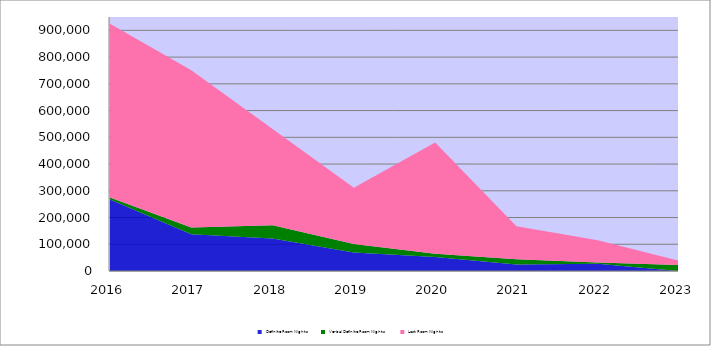
| Category | Definite Room Nights | Verbal Definite Room Nights | Lost Room Nights |
|---|---|---|---|
| 2016.0 | 266985 | 8018 | 650013 |
| 2017.0 | 137651 | 24878 | 588498 |
| 2018.0 | 121918 | 48887 | 360079 |
| 2019.0 | 68899 | 31699 | 210951 |
| 2020.0 | 52056 | 12090 | 416522 |
| 2021.0 | 23925 | 20387 | 123440 |
| 2022.0 | 27014 | 5000 | 82947 |
| 2023.0 | 0 | 22743 | 15180 |